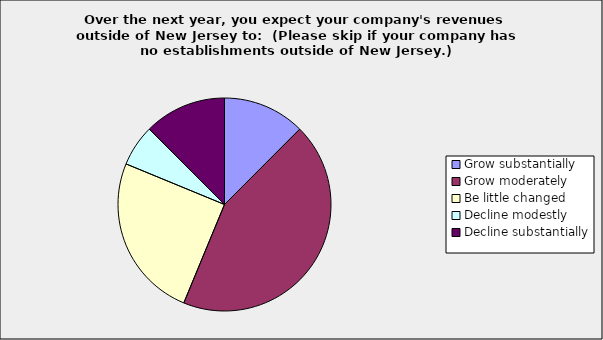
| Category | Series 0 |
|---|---|
| Grow substantially | 0.125 |
| Grow moderately | 0.438 |
| Be little changed | 0.25 |
| Decline modestly | 0.063 |
| Decline substantially | 0.125 |